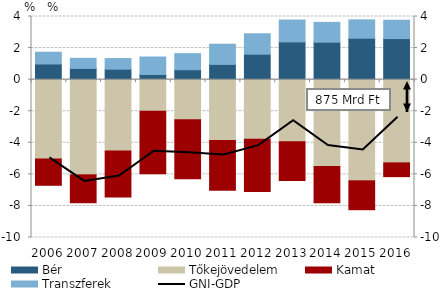
| Category | Bér | Tőkejövedelem | Kamat | Transzferek |
|---|---|---|---|---|
| 2006.0 | 0.991 | -5.026 | -1.666 | 0.745 |
| 2007.0 | 0.71 | -6.031 | -1.766 | 0.639 |
| 2008.0 | 0.664 | -4.523 | -2.917 | 0.671 |
| 2009.0 | 0.329 | -2 | -3.969 | 1.105 |
| 2010.0 | 0.629 | -2.546 | -3.74 | 1.017 |
| 2011.0 | 0.966 | -3.848 | -3.166 | 1.277 |
| 2012.0 | 1.613 | -3.772 | -3.316 | 1.293 |
| 2013.0 | 2.392 | -3.93 | -2.453 | 1.384 |
| 2014.0 | 2.372 | -5.495 | -2.306 | 1.254 |
| 2015.0 | 2.623 | -6.41 | -1.83 | 1.164 |
| 2016.0 | 2.602 | -5.273 | -0.872 | 1.162 |